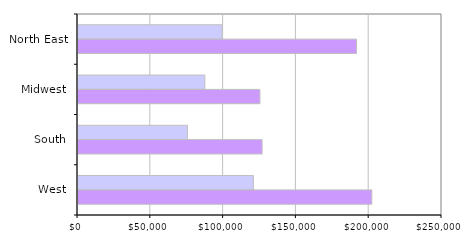
| Category | 2000 | 2010 |
|---|---|---|
| North East | 99034 | 191321 |
| Midwest | 87132 | 124956 |
| South | 75145 | 126430 |
| West | 120468 | 201793 |